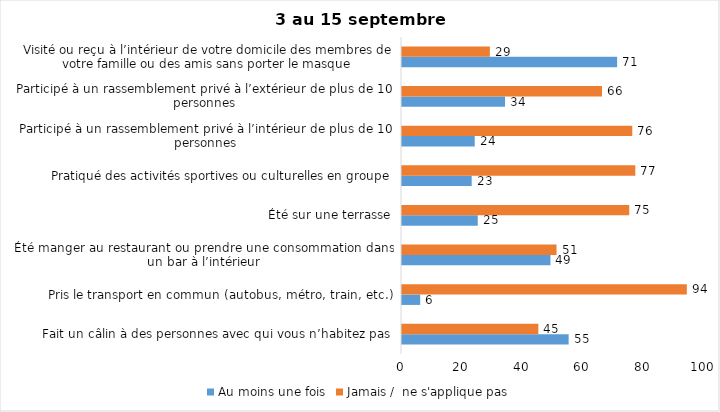
| Category | Au moins une fois | Jamais /  ne s'applique pas |
|---|---|---|
| Fait un câlin à des personnes avec qui vous n’habitez pas | 55 | 45 |
| Pris le transport en commun (autobus, métro, train, etc.) | 6 | 94 |
| Été manger au restaurant ou prendre une consommation dans un bar à l’intérieur | 49 | 51 |
| Été sur une terrasse | 25 | 75 |
| Pratiqué des activités sportives ou culturelles en groupe | 23 | 77 |
| Participé à un rassemblement privé à l’intérieur de plus de 10 personnes | 24 | 76 |
| Participé à un rassemblement privé à l’extérieur de plus de 10 personnes | 34 | 66 |
| Visité ou reçu à l’intérieur de votre domicile des membres de votre famille ou des amis sans porter le masque | 71 | 29 |